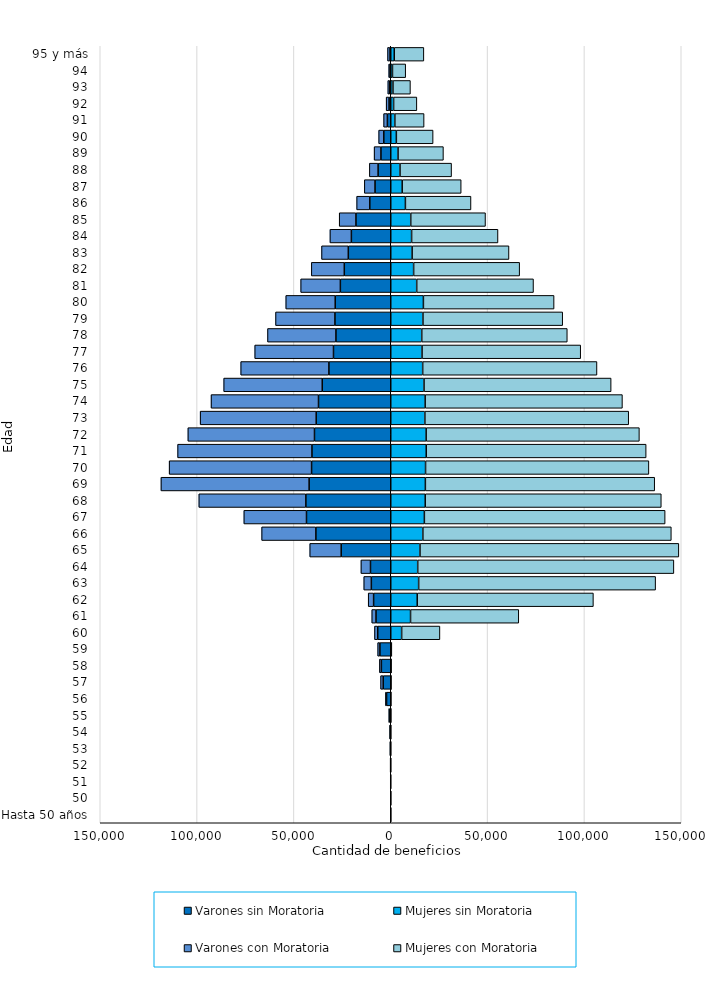
| Category | Varones sin Moratoria | Mujeres sin Moratoria | Varones con Moratoria | Mujeres con Moratoria |
|---|---|---|---|---|
| Hasta 50 años | -67 | 42 | -4 | 6 |
| 50 | -41 | 17 | -5 | 5 |
| 51 | -132 | 37 | -2 | 2 |
| 52 | -186 | 58 | -6 | 3 |
| 53 | -315 | 71 | -20 | 12 |
| 54 | -439 | 94 | -24 | 21 |
| 55 | -843 | 121 | -76 | 17 |
| 56 | -2156 | 146 | -578 | 43 |
| 57 | -3906 | 213 | -1342 | 69 |
| 58 | -4838 | 250 | -1018 | 114 |
| 59 | -5605 | 347 | -1148 | 179 |
| 60 | -6718 | 5627 | -1673 | 19770 |
| 61 | -7620 | 10215 | -2177 | 55898 |
| 62 | -8844 | 13671 | -2798 | 90963 |
| 63 | -10014 | 14402 | -3919 | 122362 |
| 64 | -10458 | 13919 | -4947 | 132280 |
| 65 | -25593 | 15101 | -16237 | 133664 |
| 66 | -38657 | 16581 | -28010 | 128292 |
| 67 | -43509 | 17360 | -32349 | 124316 |
| 68 | -43833 | 17801 | -55268 | 121895 |
| 69 | -42158 | 17872 | -76508 | 118421 |
| 70 | -40880 | 17968 | -73547 | 115324 |
| 71 | -40691 | 18330 | -69368 | 113549 |
| 72 | -39380 | 18289 | -65380 | 110094 |
| 73 | -38503 | 17628 | -59918 | 105248 |
| 74 | -37312 | 17767 | -55484 | 101863 |
| 75 | -35372 | 17185 | -50887 | 96610 |
| 76 | -31937 | 16486 | -45536 | 89999 |
| 77 | -29568 | 16168 | -40668 | 81922 |
| 78 | -28304 | 16002 | -35329 | 75154 |
| 79 | -28821 | 16630 | -30667 | 72160 |
| 80 | -28683 | 16856 | -25525 | 67479 |
| 81 | -26017 | 13405 | -20493 | 60308 |
| 82 | -23982 | 11813 | -17021 | 54755 |
| 83 | -21920 | 11039 | -13820 | 50014 |
| 84 | -20331 | 10769 | -11076 | 44605 |
| 85 | -17969 | 10323 | -8640 | 38602 |
| 86 | -10813 | 7560 | -6793 | 33873 |
| 87 | -8131 | 5910 | -5506 | 30459 |
| 88 | -6542 | 4787 | -4496 | 26617 |
| 89 | -5074 | 3775 | -3511 | 23428 |
| 90 | -3585 | 2893 | -2653 | 18975 |
| 91 | -1737 | 2120 | -1950 | 15096 |
| 92 | -872 | 1470 | -1493 | 12013 |
| 93 | -502 | 1139 | -1013 | 9022 |
| 94 | -338 | 888 | -717 | 6829 |
| 95 y más | -380 | 1815 | -1279 | 15289 |